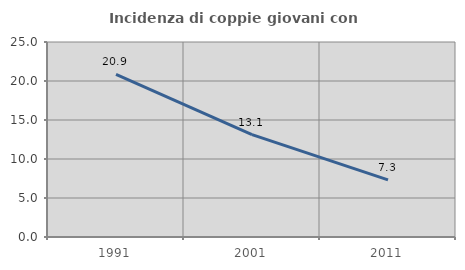
| Category | Incidenza di coppie giovani con figli |
|---|---|
| 1991.0 | 20.863 |
| 2001.0 | 13.131 |
| 2011.0 | 7.332 |